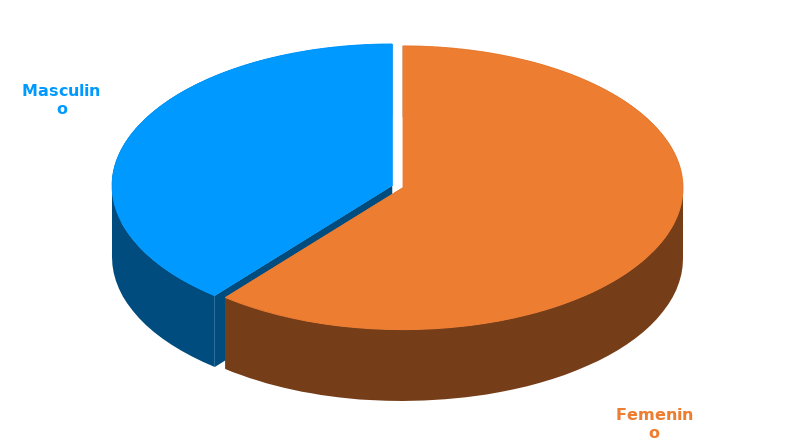
| Category | Cantidad  |
|---|---|
| Femenino | 3457 |
| Masculino | 2218 |